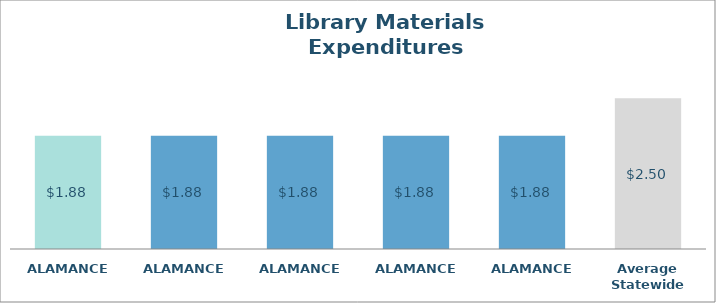
| Category | Series 0 |
|---|---|
| ALAMANCE  | 1.879 |
| ALAMANCE  | 1.879 |
| ALAMANCE  | 1.879 |
| ALAMANCE  | 1.879 |
| ALAMANCE  | 1.879 |
| Average Statewide | 2.498 |